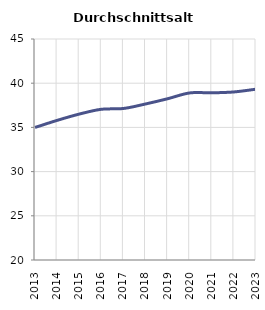
| Category | Durchschnittsalter |
|---|---|
| 2013.0 | 34.992 |
| 2014.0 | 35.794 |
| 2015.0 | 36.505 |
| 2016.0 | 37.05 |
| 2017.0 | 37.139 |
| 2018.0 | 37.649 |
| 2019.0 | 38.241 |
| 2020.0 | 38.9 |
| 2021.0 | 38.913 |
| 2022.0 | 39.01 |
| 2023.0 | 39.323 |